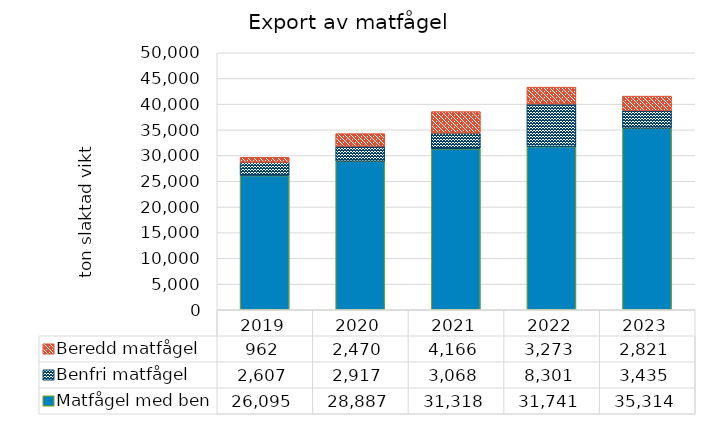
| Category | Matfågel med ben | Benfri matfågel | Beredd matfågel |
|---|---|---|---|
| 2019 | 26095 | 2607.1 | 962.22 |
| 2020 | 28887 | 2917.4 | 2469.99 |
| 2021 | 31318 | 3068.2 | 4166.22 |
| 2022 | 31741 | 8301.25 | 3273.33 |
| 2023 | 35314 | 3435.05 | 2821.26 |